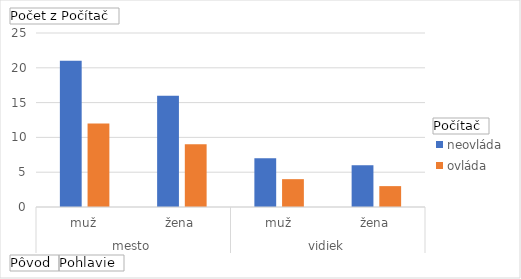
| Category | neovláda | ovláda |
|---|---|---|
| 0 | 21 | 12 |
| 1 | 16 | 9 |
| 2 | 7 | 4 |
| 3 | 6 | 3 |